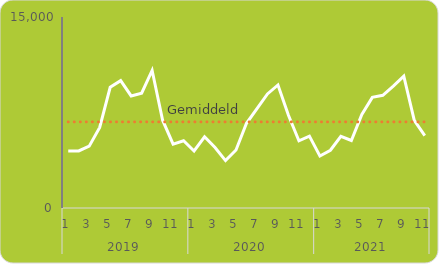
| Category | Som van Aantal | Som van Gemiddeld |
|---|---|---|
| 0 | 4486 | 6764 |
| 1 | 4483 | 6764 |
| 2 | 4860 | 6764 |
| 3 | 6332 | 6764 |
| 4 | 9480 | 6764 |
| 5 | 10002 | 6764 |
| 6 | 8802 | 6764 |
| 7 | 9019 | 6764 |
| 8 | 10801 | 6764 |
| 9 | 6894 | 6764 |
| 10 | 5013 | 6764 |
| 11 | 5278 | 6764 |
| 12 | 4479 | 6764 |
| 13 | 5590 | 6764 |
| 14 | 4747 | 6764 |
| 15 | 3723 | 6764 |
| 16 | 4552 | 6764 |
| 17 | 6651 | 6764 |
| 18 | 7809 | 6764 |
| 19 | 8957 | 6764 |
| 20 | 9661 | 6764 |
| 21 | 7280 | 6764 |
| 22 | 5273 | 6764 |
| 23 | 5647 | 6764 |
| 24 | 4085 | 6764 |
| 25 | 4536 | 6764 |
| 26 | 5625 | 6764 |
| 27 | 5301 | 6764 |
| 28 | 7345 | 6764 |
| 29 | 8690 | 6764 |
| 30 | 8849 | 6764 |
| 31 | 9575 | 6764 |
| 32 | 10358 | 6764 |
| 33 | 6876 | 6764 |
| 34 | 5681 | 6764 |